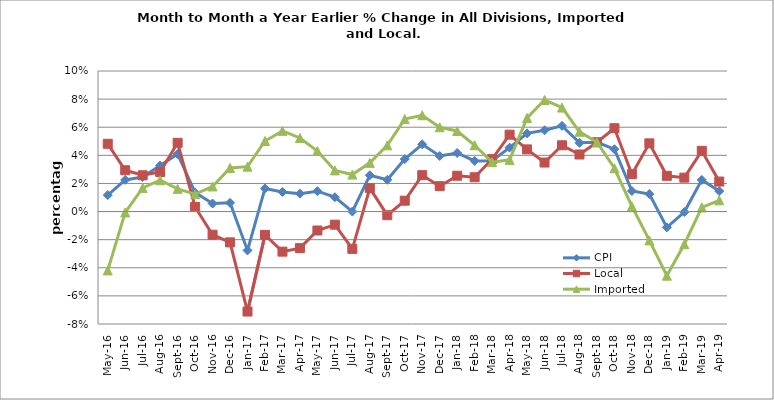
| Category | CPI | Local | Imported |
|---|---|---|---|
| 2016-05-01 | 0.012 | 0.048 | -0.042 |
| 2016-06-01 | 0.023 | 0.029 | -0.001 |
| 2016-07-01 | 0.025 | 0.026 | 0.017 |
| 2016-08-01 | 0.033 | 0.028 | 0.022 |
| 2016-09-01 | 0.041 | 0.049 | 0.016 |
| 2016-10-01 | 0.014 | 0.003 | 0.012 |
| 2016-11-01 | 0.006 | -0.016 | 0.018 |
| 2016-12-01 | 0.006 | -0.022 | 0.031 |
| 2017-01-01 | -0.028 | -0.071 | 0.032 |
| 2017-02-01 | 0.016 | -0.017 | 0.05 |
| 2017-03-01 | 0.014 | -0.029 | 0.057 |
| 2017-04-01 | 0.013 | -0.026 | 0.052 |
| 2017-05-01 | 0.015 | -0.013 | 0.043 |
| 2017-06-01 | 0.01 | -0.009 | 0.029 |
| 2017-07-01 | 0 | -0.027 | 0.026 |
| 2017-08-01 | 0.026 | 0.017 | 0.035 |
| 2017-09-01 | 0.023 | -0.003 | 0.047 |
| 2017-10-01 | 0.037 | 0.008 | 0.066 |
| 2017-11-01 | 0.048 | 0.026 | 0.069 |
| 2017-12-01 | 0.04 | 0.018 | 0.06 |
| 2018-01-01 | 0.042 | 0.025 | 0.057 |
| 2018-02-01 | 0.036 | 0.024 | 0.047 |
| 2018-03-01 | 0.036 | 0.037 | 0.035 |
| 2018-04-01 | 0.045 | 0.055 | 0.037 |
| 2018-05-01 | 0.056 | 0.044 | 0.067 |
| 2018-06-01 | 0.058 | 0.035 | 0.079 |
| 2018-07-01 | 0.061 | 0.047 | 0.074 |
| 2018-08-01 | 0.049 | 0.041 | 0.057 |
| 2018-09-01 | 0.049 | 0.049 | 0.049 |
| 2018-10-01 | 0.044 | 0.059 | 0.031 |
| 2018-11-01 | 0.015 | 0.027 | 0.004 |
| 2018-12-01 | 0.012 | 0.049 | -0.021 |
| 2019-01-01 | -0.011 | 0.025 | -0.046 |
| 2019-02-01 | 0 | 0.024 | -0.023 |
| 2019-03-01 | 0.023 | 0.043 | 0.003 |
| 2019-04-01 | 0.015 | 0.021 | 0.008 |